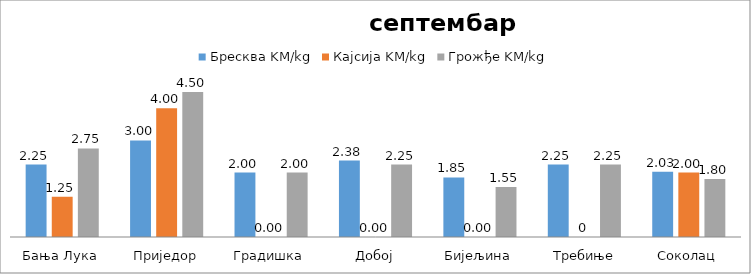
| Category | Бресква KM/kg | Кајсија KM/kg | Грожђе KM/kg |
|---|---|---|---|
| Бања Лука | 2.25 | 1.25 | 2.75 |
| Приједор | 3 | 4 | 4.5 |
| Градишка | 2 | 0 | 2 |
| Добој | 2.375 | 0 | 2.25 |
| Бијељина | 1.85 | 0 | 1.55 |
|  Требиње | 2.25 | 0 | 2.25 |
| Соколац | 2.025 | 2 | 1.8 |